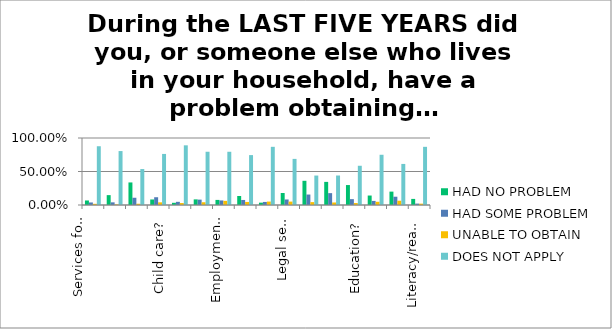
| Category | HAD NO PROBLEM | HAD SOME PROBLEM | UNABLE TO OBTAIN | DOES NOT APPLY |
|---|---|---|---|---|
| Services for victims of abuse? | 0.068 | 0.038 | 0.018 | 0.877 |
| Hospice services? | 0.147 | 0.04 | 0.008 | 0.805 |
| Rehabilitation (physical/occupational/speech therapy)? | 0.337 | 0.108 | 0.018 | 0.537 |
| Child care? | 0.082 | 0.116 | 0.04 | 0.762 |
| Adult day care? | 0.033 | 0.047 | 0.029 | 0.891 |
| Crisis information services? | 0.084 | 0.08 | 0.041 | 0.795 |
| Employment training? | 0.076 | 0.068 | 0.062 | 0.795 |
| Food bank/ food pantry services? | 0.135 | 0.075 | 0.046 | 0.745 |
| Temporary or emergency housing? | 0.035 | 0.046 | 0.051 | 0.868 |
| Legal services? | 0.179 | 0.082 | 0.051 | 0.688 |
| Utilities? | 0.361 | 0.156 | 0.043 | 0.44 |
| Clothing? | 0.345 | 0.177 | 0.038 | 0.44 |
| Education? | 0.298 | 0.088 | 0.029 | 0.586 |
| Budgeting information? | 0.141 | 0.061 | 0.048 | 0.75 |
| Transportation? | 0.2 | 0.124 | 0.064 | 0.613 |
| Literacy/reading help? | 0.091 | 0.021 | 0.02 | 0.868 |